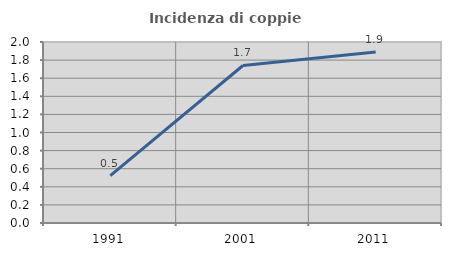
| Category | Incidenza di coppie miste |
|---|---|
| 1991.0 | 0.523 |
| 2001.0 | 1.741 |
| 2011.0 | 1.889 |